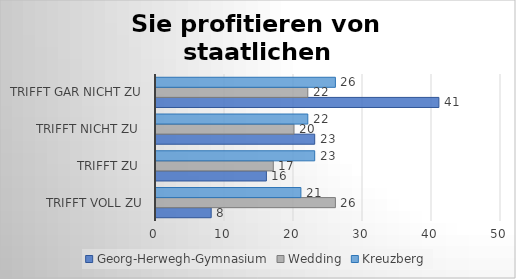
| Category | Georg-Herwegh-Gymnasium | Wedding | Kreuzberg |
|---|---|---|---|
| trifft voll zu | 8 | 26 | 21 |
| trifft zu  | 16 | 17 | 23 |
| trifft nicht zu  | 23 | 20 | 22 |
| trifft gar nicht zu | 41 | 22 | 26 |